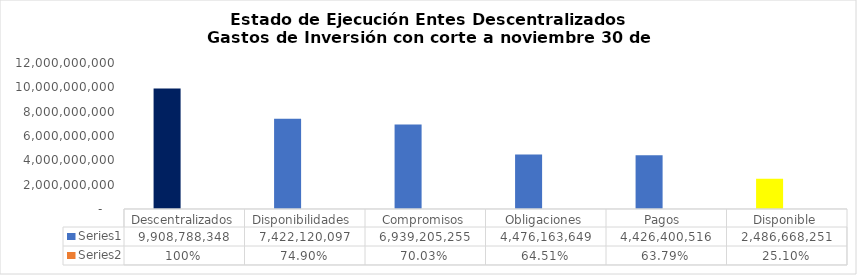
| Category | Series 0 | Series 1 |
|---|---|---|
| Descentralizados | 9908788347.9 | 1 |
| Disponibilidades  | 7422120097.164 | 0.749 |
| Compromisos | 6939205254.84 | 0.7 |
| Obligaciones | 4476163649.44 | 0.645 |
| Pagos  | 4426400516.44 | 0.638 |
|  Disponible  | 2486668250.736 | 0.251 |